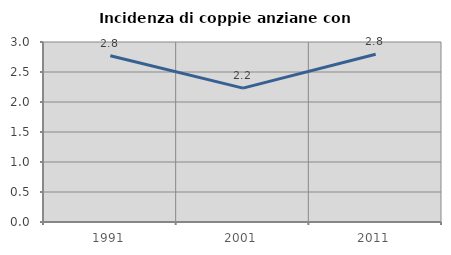
| Category | Incidenza di coppie anziane con figli |
|---|---|
| 1991.0 | 2.772 |
| 2001.0 | 2.231 |
| 2011.0 | 2.797 |